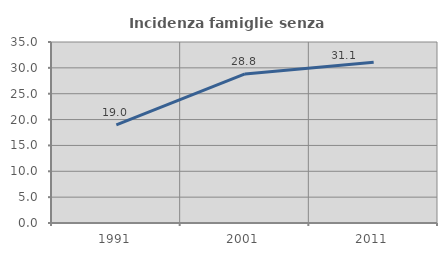
| Category | Incidenza famiglie senza nuclei |
|---|---|
| 1991.0 | 18.993 |
| 2001.0 | 28.817 |
| 2011.0 | 31.084 |